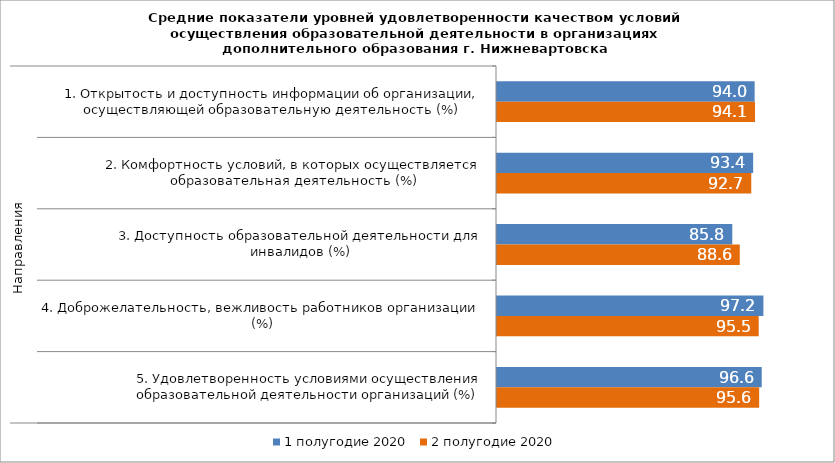
| Category | 1 полугодие 2020 | 2 полугодие 2020 |
|---|---|---|
| 0 | 93.97 | 94.115 |
| 1 | 93.435 | 92.74 |
| 2 | 85.815 | 88.55 |
| 3 | 97.165 | 95.45 |
| 4 | 96.555 | 95.63 |